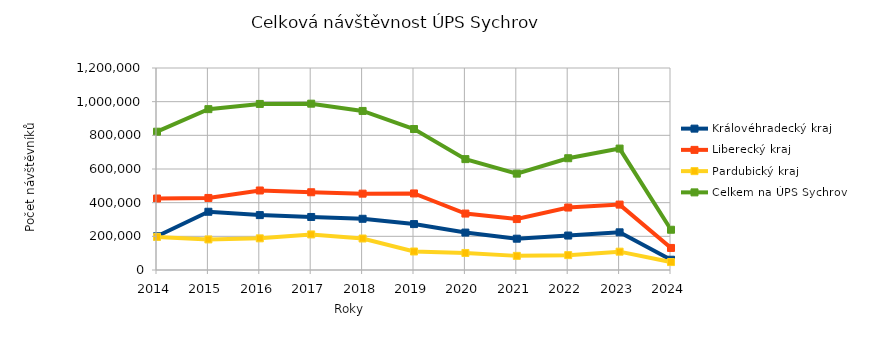
| Category | Královéhradecký kraj | Liberecký kraj | Pardubický kraj | Celkem na ÚPS Sychrov |
|---|---|---|---|---|
| 2014.0 | 200438 | 424718 | 196473 | 821629 |
| 2015.0 | 345970 | 428023 | 181567 | 955560 |
| 2016.0 | 326137 | 472318 | 188108 | 986563 |
| 2017.0 | 314983 | 461803 | 211268 | 988054 |
| 2018.0 | 304267 | 453568 | 187017 | 944852 |
| 2019.0 | 272720 | 454785 | 109949 | 837454 |
| 2020.0 | 222238 | 335261 | 101211 | 658710 |
| 2021.0 | 185934 | 302574 | 83925 | 572433 |
| 2022.0 | 204678 | 371041 | 88282 | 664001 |
| 2023.0 | 223799 | 388530 | 108959 | 721288 |
| 2024.0 | 61041 | 131023 | 47070 | 239134 |